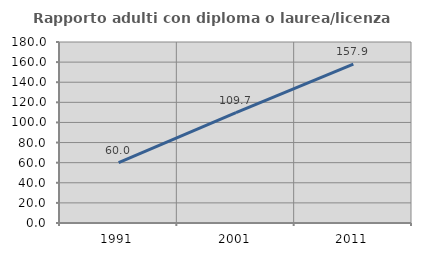
| Category | Rapporto adulti con diploma o laurea/licenza media  |
|---|---|
| 1991.0 | 59.953 |
| 2001.0 | 109.677 |
| 2011.0 | 157.907 |